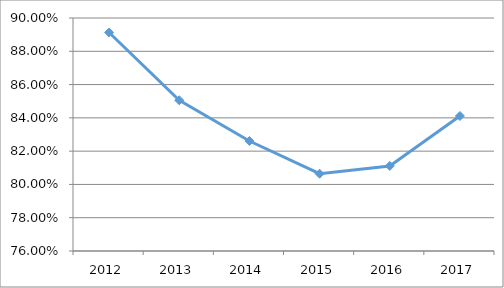
| Category | EXAR-D3O17 |
|---|---|
| 2012.0 | 0.891 |
| 2013.0 | 0.851 |
| 2014.0 | 0.826 |
| 2015.0 | 0.806 |
| 2016.0 | 0.811 |
| 2017.0 | 0.841 |